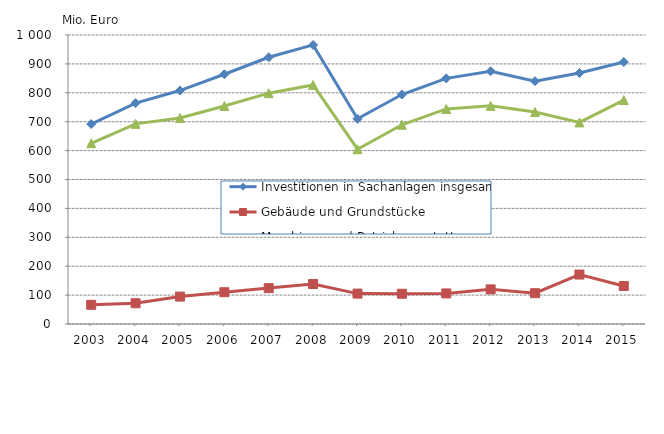
| Category | Investitionen in Sachanlagen insgesamt | Gebäude und Grundstücke | Maschinen und Betriebsausstattung |
|---|---|---|---|
| 2003.0 | 691.84 | 66.441 | 625.399 |
| 2004.0 | 764.337 | 71.81 | 692.527 |
| 2005.0 | 807.73 | 94.864 | 712.866 |
| 2006.0 | 864.202 | 109.907 | 754.295 |
| 2007.0 | 922.931 | 124.199 | 798.732 |
| 2008.0 | 965.705 | 138.389 | 827.316 |
| 2009.0 | 710.022 | 105.189 | 604.833 |
| 2010.0 | 794.111 | 104.71 | 689.4 |
| 2011.0 | 849.849 | 105.76 | 744.089 |
| 2012.0 | 874.648 | 119.797 | 754.851 |
| 2013.0 | 840.137 | 106.586 | 733.551 |
| 2014.0 | 868.615 | 171.128 | 697.487 |
| 2015.0 | 906.511 | 131.559 | 774.952 |